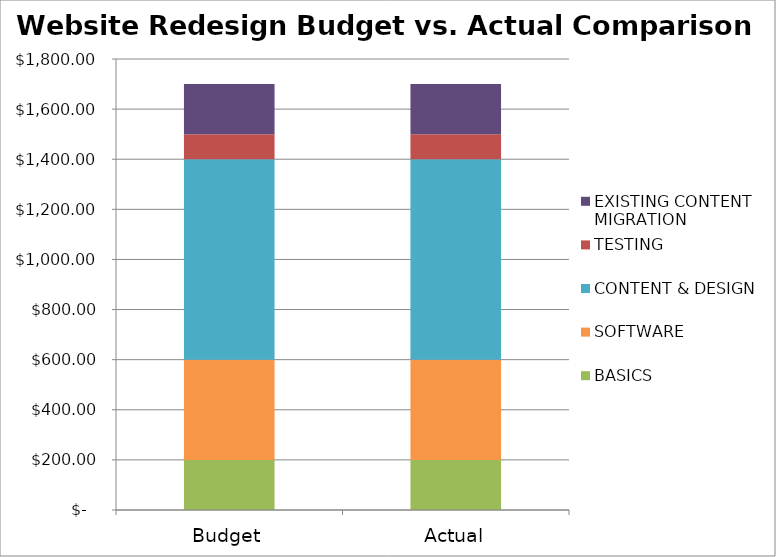
| Category | BASICS | SOFTWARE | CONTENT & DESIGN | TESTING | EXISTING CONTENT MIGRATION |
|---|---|---|---|---|---|
| Budget | 200 | 400 | 800 | 100 | 200 |
| Actual | 200 | 400 | 800 | 100 | 200 |